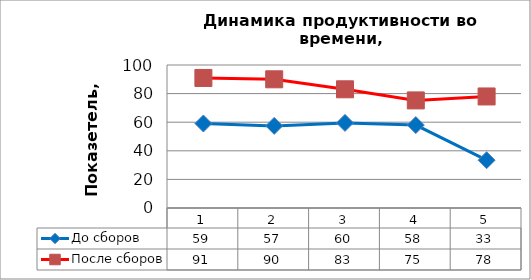
| Category | До сборов | После сборов |
|---|---|---|
| 0 | 59.091 | 90.938 |
| 1 | 57.429 | 90 |
| 2 | 59.5 | 83 |
| 3 | 58 | 75.238 |
| 4 | 33.429 | 78 |